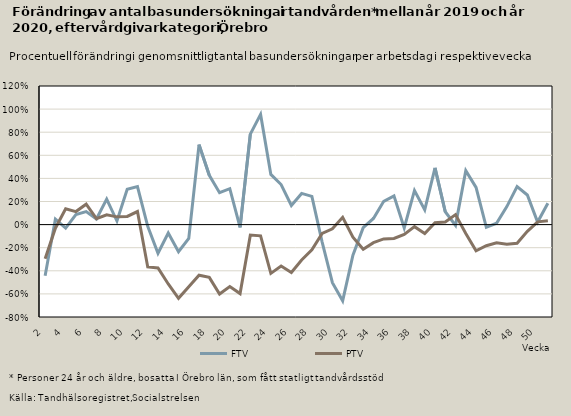
| Category | FTV | PTV |
|---|---|---|
| 2.0 | -0.444 | -0.296 |
| 3.0 | 0.048 | -0.031 |
| 4.0 | -0.03 | 0.137 |
| 5.0 | 0.088 | 0.113 |
| 6.0 | 0.113 | 0.176 |
| 7.0 | 0.048 | 0.051 |
| 8.0 | 0.221 | 0.085 |
| 9.0 | 0.031 | 0.067 |
| 10.0 | 0.307 | 0.071 |
| 11.0 | 0.329 | 0.113 |
| 12.0 | -0.015 | -0.366 |
| 13.0 | -0.248 | -0.376 |
| 14.0 | -0.073 | -0.514 |
| 15.0 | -0.235 | -0.638 |
| 16.0 | -0.12 | -0.538 |
| 17.0 | 0.693 | -0.438 |
| 18.0 | 0.427 | -0.457 |
| 19.0 | 0.276 | -0.601 |
| 20.0 | 0.311 | -0.537 |
| 21.0 | -0.024 | -0.597 |
| 22.0 | 0.783 | -0.091 |
| 23.0 | 0.954 | -0.097 |
| 24.0 | 0.434 | -0.422 |
| 25.0 | 0.347 | -0.359 |
| 26.0 | 0.165 | -0.414 |
| 27.0 | 0.27 | -0.307 |
| 28.0 | 0.244 | -0.219 |
| 29.0 | -0.152 | -0.076 |
| 30.0 | -0.502 | -0.036 |
| 31.0 | -0.66 | 0.063 |
| 32.0 | -0.265 | -0.109 |
| 33.0 | -0.027 | -0.213 |
| 34.0 | 0.053 | -0.157 |
| 35.0 | 0.201 | -0.124 |
| 36.0 | 0.249 | -0.12 |
| 37.0 | -0.029 | -0.085 |
| 38.0 | 0.295 | -0.018 |
| 39.0 | 0.128 | -0.078 |
| 40.0 | 0.491 | 0.017 |
| 41.0 | 0.111 | 0.023 |
| 42.0 | -0.007 | 0.086 |
| 43.0 | 0.467 | -0.077 |
| 44.0 | 0.322 | -0.227 |
| 45.0 | -0.023 | -0.183 |
| 46.0 | 0.012 | -0.157 |
| 47.0 | 0.156 | -0.17 |
| 48.0 | 0.329 | -0.162 |
| 49.0 | 0.256 | -0.059 |
| 50.0 | 0.022 | 0.024 |
| 51.0 | 0.185 | 0.033 |